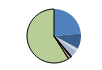
| Category | Series 0 |
|---|---|
| ARRASTRE | 313 |
| CERCO | 119 |
| ATUNEROS CAÑEROS | 6 |
| PALANGRE DE FONDO | 20 |
| PALANGRE DE SUPERFICIE | 51 |
| RASCO | 6 |
| VOLANTA | 8 |
| ARTES FIJAS | 23 |
| ARTES MENORES | 786 |